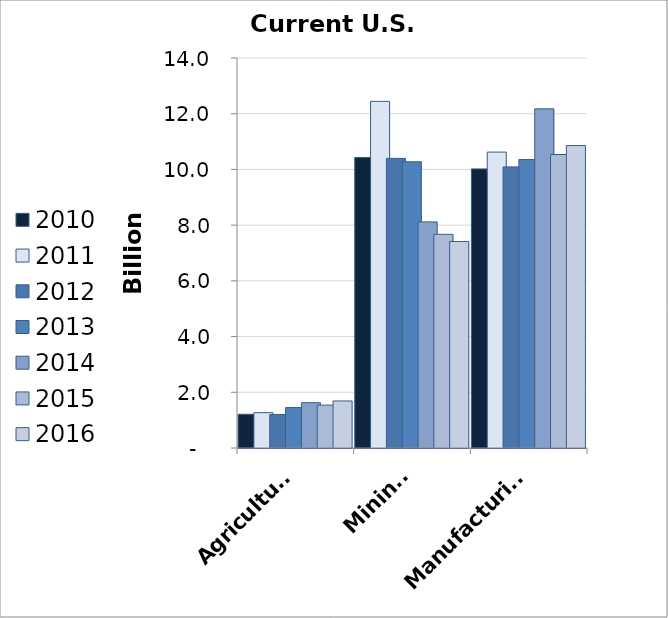
| Category | 2010 | 2011 | 2012 | 2013 | 2014 | 2015 | 2016 |
|---|---|---|---|---|---|---|---|
| Agriculture | 1.212 | 1.269 | 1.203 | 1.451 | 1.626 | 1.539 | 1.689 |
| Mining | 10.43 | 12.443 | 10.396 | 10.275 | 8.117 | 7.67 | 7.414 |
| Manufacturing | 10.018 | 10.623 | 10.091 | 10.357 | 12.176 | 10.536 | 10.857 |